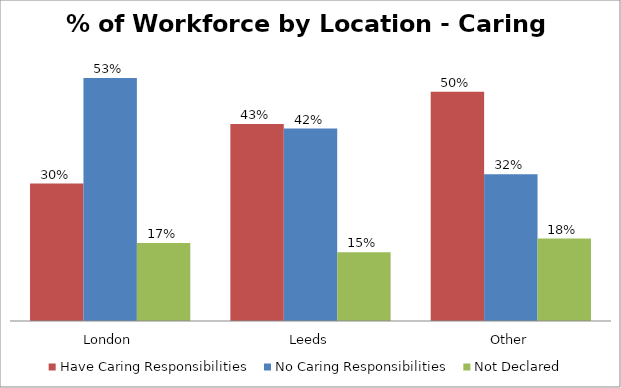
| Category | Have Caring Responsibilities | No Caring Responsibilities | Not Declared |
|---|---|---|---|
| London | 0.3 | 0.53 | 0.17 |
| Leeds | 0.43 | 0.42 | 0.15 |
| Other | 0.5 | 0.32 | 0.18 |